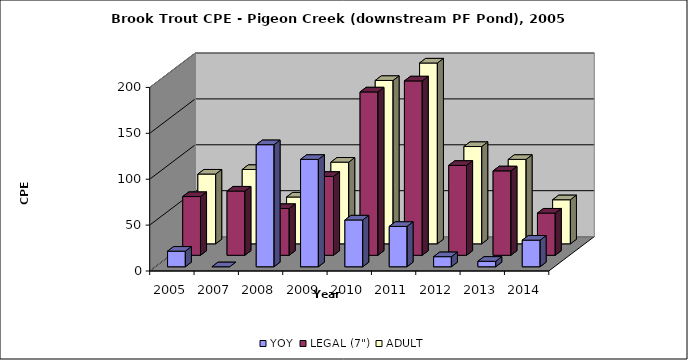
| Category | YOY | LEGAL (7") | ADULT |
|---|---|---|---|
| 2005.0 | 17 | 64 | 76 |
| 2007.0 | 0 | 70 | 81 |
| 2008.0 | 133 | 51 | 51 |
| 2009.0 | 117 | 86 | 89 |
| 2010.0 | 51 | 178 | 178 |
| 2011.0 | 44 | 190 | 197 |
| 2012.0 | 11 | 98 | 106 |
| 2013.0 | 6 | 92 | 92 |
| 2014.0 | 29 | 46 | 48 |